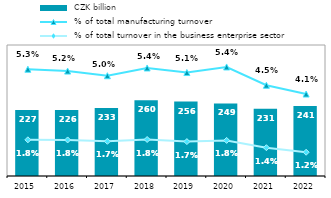
| Category |  CZK billion |
|---|---|
| 2015.0 | 226.828 |
| 2016.0 | 226.336 |
| 2017.0 | 233.272 |
| 2018.0 | 260.301 |
| 2019.0 | 255.587 |
| 2020.0 | 249.315 |
| 2021.0 | 231.363 |
| 2022.0 | 240.672 |